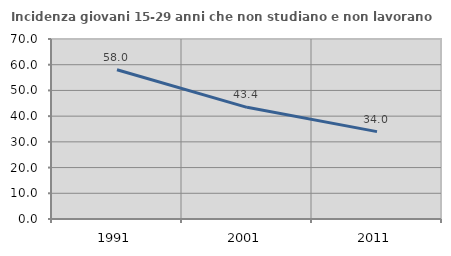
| Category | Incidenza giovani 15-29 anni che non studiano e non lavorano  |
|---|---|
| 1991.0 | 58.022 |
| 2001.0 | 43.426 |
| 2011.0 | 33.978 |